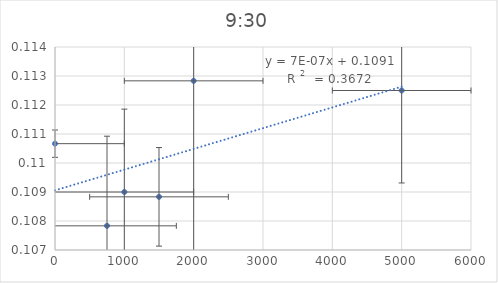
| Category | Series 0 |
|---|---|
| 750.0 | 0.108 |
| 1000.0 | 0.109 |
| 1500.0 | 0.109 |
| 2000.0 | 0.113 |
| 5000.0 | 0.112 |
| 0.0 | 0.111 |